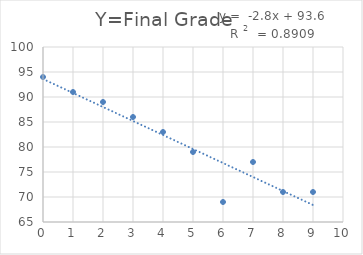
| Category | Y=Final Grade  |
|---|---|
| 2.0 | 89 |
| 5.0 | 79 |
| 7.0 | 77 |
| 3.0 | 86 |
| 9.0 | 71 |
| 6.0 | 69 |
| 4.0 | 83 |
| 8.0 | 71 |
| 0.0 | 94 |
| 1.0 | 91 |